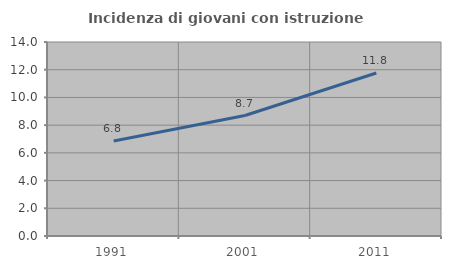
| Category | Incidenza di giovani con istruzione universitaria |
|---|---|
| 1991.0 | 6.849 |
| 2001.0 | 8.696 |
| 2011.0 | 11.765 |